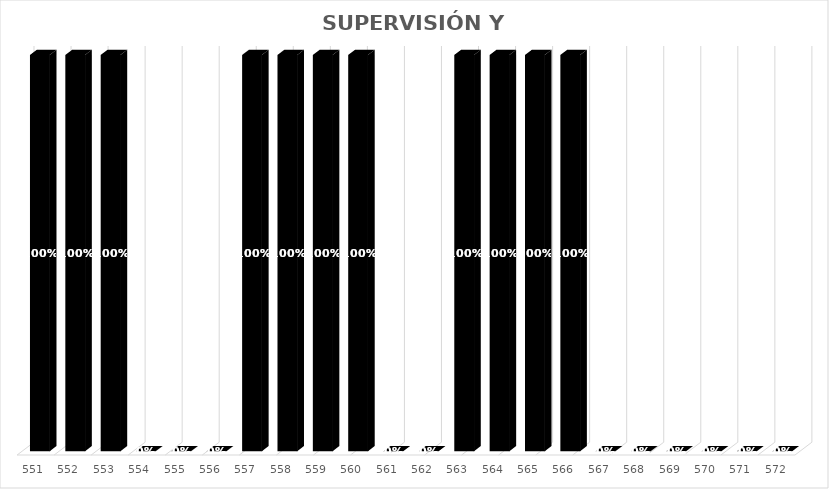
| Category | % Avance |
|---|---|
| 551.0 | 1 |
| 552.0 | 1 |
| 553.0 | 1 |
| 554.0 | 0 |
| 555.0 | 0 |
| 556.0 | 0 |
| 557.0 | 1 |
| 558.0 | 1 |
| 559.0 | 1 |
| 560.0 | 1 |
| 561.0 | 0 |
| 562.0 | 0 |
| 563.0 | 1 |
| 564.0 | 1 |
| 565.0 | 1 |
| 566.0 | 1 |
| 567.0 | 0 |
| 568.0 | 0 |
| 569.0 | 0 |
| 570.0 | 0 |
| 571.0 | 0 |
| 572.0 | 0 |